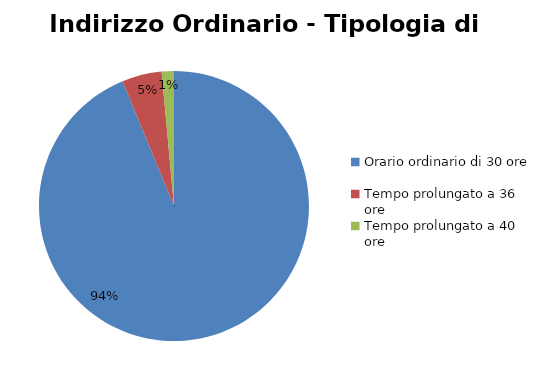
| Category | Series 0 |
|---|---|
| Orario ordinario di 30 ore | 33864 |
| Tempo prolungato a 36 ore | 1719 |
| Tempo prolungato a 40 ore | 529 |